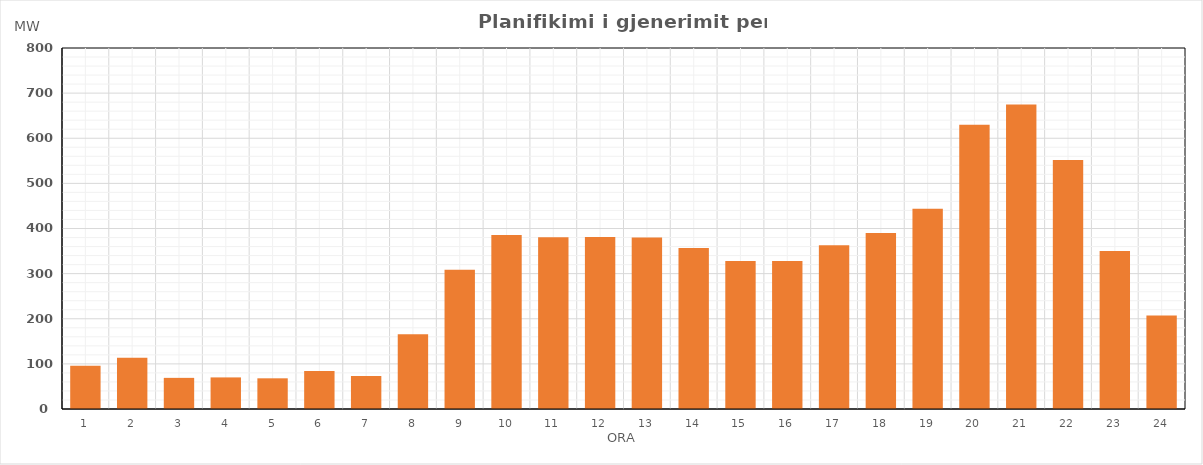
| Category | Max (MW) |
|---|---|
| 0 | 96 |
| 1 | 113.36 |
| 2 | 69 |
| 3 | 70 |
| 4 | 68 |
| 5 | 84.354 |
| 6 | 73.069 |
| 7 | 165.537 |
| 8 | 308.311 |
| 9 | 385.833 |
| 10 | 380.815 |
| 11 | 381 |
| 12 | 380 |
| 13 | 357 |
| 14 | 328 |
| 15 | 328 |
| 16 | 363 |
| 17 | 390 |
| 18 | 444 |
| 19 | 630 |
| 20 | 675 |
| 21 | 552 |
| 22 | 350 |
| 23 | 207 |